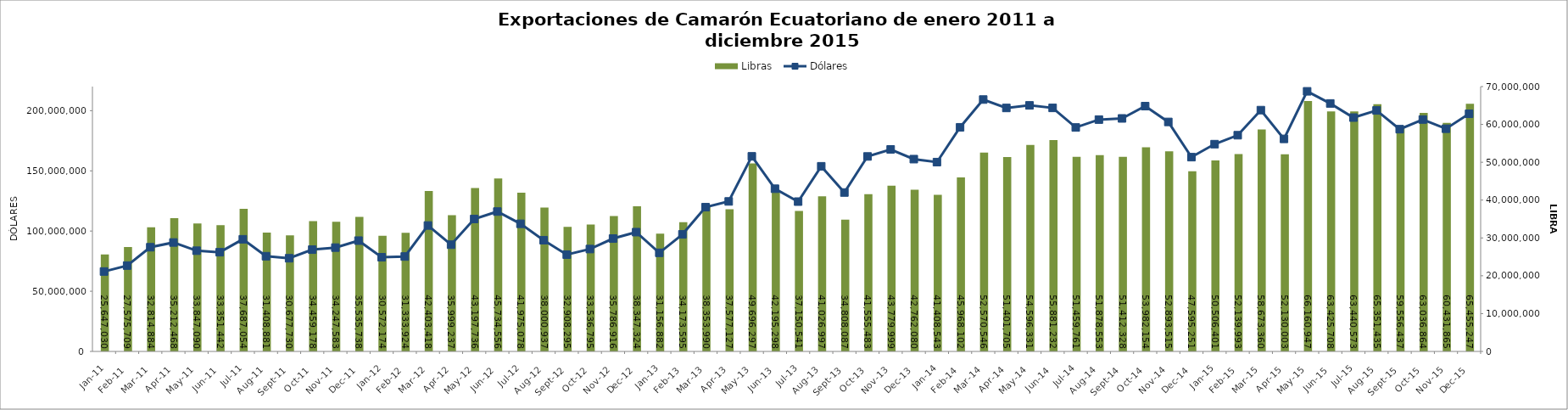
| Category | Libras  |
|---|---|
| 2011-01-01 | 25647030 |
| 2011-02-01 | 27575709 |
| 2011-03-01 | 32814884 |
| 2011-04-01 | 35212468 |
| 2011-05-01 | 33847090 |
| 2011-06-01 | 33351442 |
| 2011-07-01 | 37687054 |
| 2011-08-01 | 31408881 |
| 2011-09-01 | 30677730 |
| 2011-10-01 | 34459178 |
| 2011-11-01 | 34247583 |
| 2011-12-01 | 35535738 |
| 2012-01-01 | 30572174 |
| 2012-02-01 | 31333924 |
| 2012-03-01 | 42403418 |
| 2012-04-01 | 35999237 |
| 2012-05-01 | 43197736 |
| 2012-06-01 | 45734556 |
| 2012-07-01 | 41975078 |
| 2012-08-01 | 38000937 |
| 2012-09-01 | 32908295 |
| 2012-10-01 | 33536795 |
| 2012-11-01 | 35786916 |
| 2012-12-01 | 38347324 |
| 2013-01-01 | 31156882 |
| 2013-02-01 | 34173595 |
| 2013-03-01 | 38353990 |
| 2013-04-01 | 37577127 |
| 2013-05-01 | 49696297 |
| 2013-06-01 | 42195298 |
| 2013-07-01 | 37150541 |
| 2013-08-01 | 41026997 |
| 2013-09-01 | 34808087 |
| 2013-10-01 | 41555483 |
| 2013-11-01 | 43779999 |
| 2013-12-01 | 42762080 |
| 2014-01-01 | 41408543 |
| 2014-02-01 | 45968102 |
| 2014-03-01 | 52570546 |
| 2014-04-01 | 51401705 |
| 2014-05-01 | 54596331 |
| 2014-06-01 | 55881232 |
| 2014-07-01 | 51459761 |
| 2014-08-01 | 51878553 |
| 2014-09-01 | 51412328 |
| 2014-10-01 | 53982154 |
| 2014-11-01 | 52893515 |
| 2014-12-01 | 47595251 |
| 2015-01-01 | 50506401 |
| 2015-02-01 | 52139993 |
| 2015-03-01 | 58673360 |
| 2015-04-01 | 52130003 |
| 2015-05-01 | 66160947 |
| 2015-06-01 | 63425708 |
| 2015-07-01 | 63440573 |
| 2015-08-01 | 65351435 |
| 2015-09-01 | 59556437 |
| 2015-10-01 | 63036864 |
| 2015-11-01 | 60431865 |
| 2015-12-01 | 65455247 |